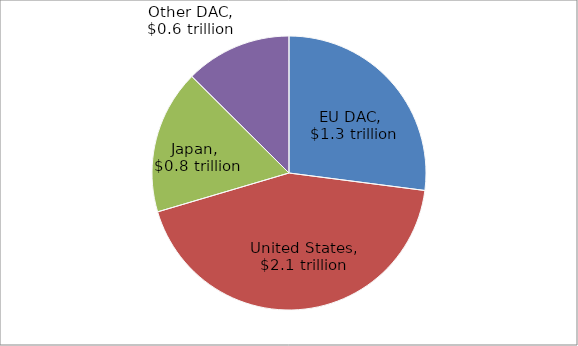
| Category | Series 0 |
|---|---|
| EU DAC | 1.313 |
| United States | 2.106 |
| Japan | 0.827 |
| Other DAC | 0.609 |